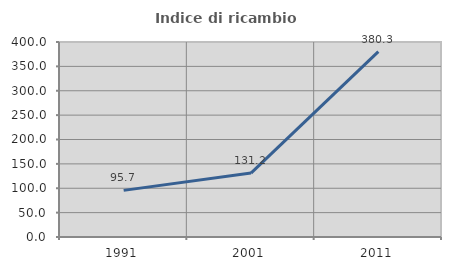
| Category | Indice di ricambio occupazionale  |
|---|---|
| 1991.0 | 95.661 |
| 2001.0 | 131.2 |
| 2011.0 | 380.311 |